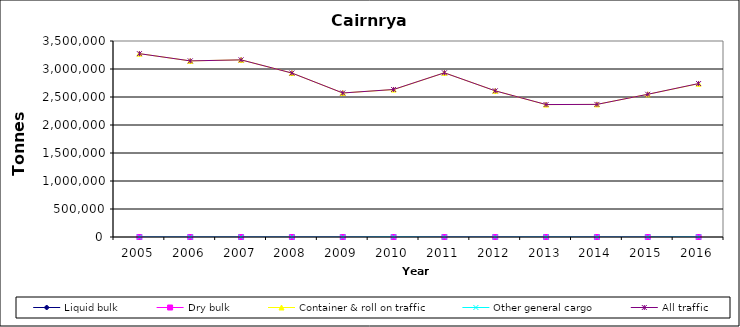
| Category | Liquid bulk | Dry bulk | Container & roll on traffic | Other general cargo | All traffic |
|---|---|---|---|---|---|
| 2005.0 | 0 | 0 | 3274000 | 0 | 3274000 |
| 2006.0 | 0 | 0 | 3145000 | 0 | 3145000 |
| 2007.0 | 0 | 0 | 3163000 | 0 | 3163000 |
| 2008.0 | 0 | 0 | 2928000 | 0 | 2928000 |
| 2009.0 | 0 | 0 | 2571913 | 0 | 2571913 |
| 2010.0 | 0 | 0 | 2632000 | 3000 | 2634000 |
| 2011.0 | 0 | 0 | 2932000 | 0 | 2932000 |
| 2012.0 | 0 | 0 | 2610000 | 0 | 2610000 |
| 2013.0 | 0 | 0 | 2364000 | 1000 | 2365000 |
| 2014.0 | 0 | 0 | 2368000 | 0 | 2368000 |
| 2015.0 | 0 | 0 | 2548000 | 0 | 2548000 |
| 2016.0 | 0 | 0 | 2737000 | 3000 | 2740000 |